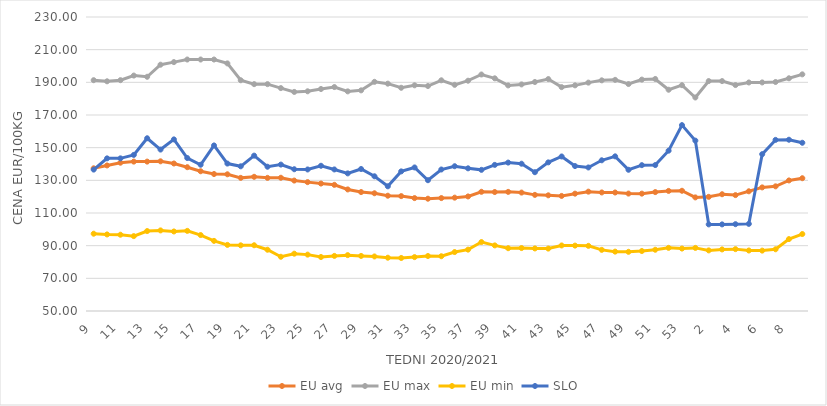
| Category | EU avg | EU max | EU min | SLO |
|---|---|---|---|---|
| 9.0 | 137.361 | 191.31 | 97.323 | 136.58 |
| 10.0 | 139.118 | 190.63 | 96.874 | 143.45 |
| 11.0 | 140.789 | 191.32 | 96.705 | 143.45 |
| 12.0 | 141.467 | 194.15 | 95.845 | 145.57 |
| 13.0 | 141.466 | 193.4 | 98.945 | 155.76 |
| 14.0 | 141.645 | 200.79 | 99.347 | 148.84 |
| 15.0 | 140.306 | 202.38 | 98.696 | 155.07 |
| 16.0 | 138.046 | 203.97 | 99.065 | 143.65 |
| 17.0 | 135.556 | 203.97 | 96.499 | 139.55 |
| 18.0 | 133.857 | 203.97 | 92.931 | 151.36 |
| 19.0 | 133.702 | 201.59 | 90.48 | 140.27 |
| 20.0 | 131.51 | 191.27 | 90.199 | 138.59 |
| 21.0 | 132.157 | 188.89 | 90.255 | 145.12 |
| 22.0 | 131.509 | 188.89 | 87.513 | 138.33 |
| 23.0 | 131.578 | 186.47 | 83.199 | 139.64 |
| 24.0 | 129.861 | 184.13 | 85.09 | 136.79 |
| 25.0 | 128.899 | 184.51 | 84.52 | 136.65 |
| 26.0 | 128.034 | 185.91 | 83.06 | 138.92 |
| 27.0 | 127.242 | 187.11 | 83.73 | 136.67 |
| 28.0 | 124.426 | 184.46 | 84.2 | 134.25 |
| 29.0 | 122.822 | 185.09 | 83.72 | 136.94 |
| 30.0 | 122.086 | 190.31 | 83.4 | 132.48 |
| 31.0 | 120.581 | 189.19 | 82.63 | 126.34 |
| 32.0 | 120.341 | 186.67 | 82.46 | 135.48 |
| 33.0 | 119.127 | 188.18 | 82.99 | 137.89 |
| 34.0 | 118.75 | 187.74 | 83.66 | 130.07 |
| 35.0 | 119.136 | 191.25 | 83.53 | 136.63 |
| 36.0 | 119.398 | 188.47 | 86.09 | 138.64 |
| 37.0 | 120.135 | 190.99 | 87.57 | 137.35 |
| 38.0 | 122.982 | 194.8 | 92.21 | 136.42 |
| 39.0 | 122.832 | 192.45 | 90.16 | 139.46 |
| 40.0 | 122.936 | 188.11 | 88.45 | 140.87 |
| 41.0 | 122.507 | 188.73 | 88.54 | 140.18 |
| 42.0 | 121.098 | 190.2 | 88.3 | 134.98 |
| 43.0 | 120.822 | 191.99 | 88.22 | 141 |
| 44.0 | 120.448 | 187.06 | 90.13 | 144.61 |
| 45.0 | 121.843 | 188.15 | 90.04 | 138.73 |
| 46.0 | 123.07 | 189.82 | 89.89 | 137.88 |
| 47.0 | 122.58 | 191.22 | 87.43 | 142.27 |
| 48.0 | 122.553 | 191.52 | 86.35 | 144.69 |
| 49.0 | 121.893 | 188.97 | 86.24 | 136.47 |
| 50.0 | 121.851 | 191.67 | 86.72 | 139.29 |
| 51.0 | 122.8 | 192.06 | 87.5 | 139.35 |
| 52.0 | 123.52 | 185.468 | 88.67 | 148.16 |
| 53.0 | 123.611 | 188.25 | 88.23 | 163.81 |
| 1.0 | 119.553 | 180.72 | 88.64 | 154.31 |
| 2.0 | 119.893 | 190.77 | 87.1 | 103.02 |
| 3.0 | 121.489 | 190.76 | 87.7 | 103.03 |
| 4.0 | 120.954 | 188.33 | 87.88 | 103.15 |
| 5.0 | 123.293 | 189.91 | 87.04 | 103.34 |
| 6.0 | 125.679 | 189.94 | 86.97 | 146.03 |
| 7.0 | 126.326 | 190.21 | 87.79 | 154.77 |
| 8.0 | 129.933 | 192.48 | 94.02 | 154.86 |
| 9.0 | 131.295 | 194.884 | 97.12 | 153 |